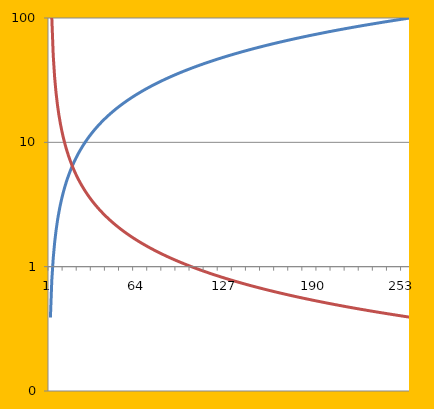
| Category | Series 0 | Series 1 |
|---|---|---|
| 0 | 0 | 0 |
| 1 | 0.391 | 100 |
| 2 | 0.781 | 100 |
| 3 | 1.172 | 50 |
| 4 | 1.562 | 33.333 |
| 5 | 1.953 | 25 |
| 6 | 2.344 | 20 |
| 7 | 2.734 | 16.667 |
| 8 | 3.125 | 14.286 |
| 9 | 3.516 | 12.5 |
| 10 | 3.906 | 11.111 |
| 11 | 4.297 | 10 |
| 12 | 4.688 | 9.091 |
| 13 | 5.078 | 8.333 |
| 14 | 5.469 | 7.692 |
| 15 | 5.859 | 7.143 |
| 16 | 6.25 | 6.667 |
| 17 | 6.641 | 6.25 |
| 18 | 7.031 | 5.882 |
| 19 | 7.422 | 5.556 |
| 20 | 7.812 | 5.263 |
| 21 | 8.203 | 5 |
| 22 | 8.594 | 4.762 |
| 23 | 8.984 | 4.545 |
| 24 | 9.375 | 4.348 |
| 25 | 9.766 | 4.167 |
| 26 | 10.156 | 4 |
| 27 | 10.547 | 3.846 |
| 28 | 10.938 | 3.704 |
| 29 | 11.328 | 3.571 |
| 30 | 11.719 | 3.448 |
| 31 | 12.109 | 3.333 |
| 32 | 12.5 | 3.226 |
| 33 | 12.891 | 3.125 |
| 34 | 13.281 | 3.03 |
| 35 | 13.672 | 2.941 |
| 36 | 14.062 | 2.857 |
| 37 | 14.453 | 2.778 |
| 38 | 14.844 | 2.703 |
| 39 | 15.234 | 2.632 |
| 40 | 15.625 | 2.564 |
| 41 | 16.016 | 2.5 |
| 42 | 16.406 | 2.439 |
| 43 | 16.797 | 2.381 |
| 44 | 17.188 | 2.326 |
| 45 | 17.578 | 2.273 |
| 46 | 17.969 | 2.222 |
| 47 | 18.359 | 2.174 |
| 48 | 18.75 | 2.128 |
| 49 | 19.141 | 2.083 |
| 50 | 19.531 | 2.041 |
| 51 | 19.922 | 2 |
| 52 | 20.312 | 1.961 |
| 53 | 20.703 | 1.923 |
| 54 | 21.094 | 1.887 |
| 55 | 21.484 | 1.852 |
| 56 | 21.875 | 1.818 |
| 57 | 22.266 | 1.786 |
| 58 | 22.656 | 1.754 |
| 59 | 23.047 | 1.724 |
| 60 | 23.438 | 1.695 |
| 61 | 23.828 | 1.667 |
| 62 | 24.219 | 1.639 |
| 63 | 24.609 | 1.613 |
| 64 | 25 | 1.587 |
| 65 | 25.391 | 1.562 |
| 66 | 25.781 | 1.538 |
| 67 | 26.172 | 1.515 |
| 68 | 26.562 | 1.493 |
| 69 | 26.953 | 1.471 |
| 70 | 27.344 | 1.449 |
| 71 | 27.734 | 1.429 |
| 72 | 28.125 | 1.408 |
| 73 | 28.516 | 1.389 |
| 74 | 28.906 | 1.37 |
| 75 | 29.297 | 1.351 |
| 76 | 29.688 | 1.333 |
| 77 | 30.078 | 1.316 |
| 78 | 30.469 | 1.299 |
| 79 | 30.859 | 1.282 |
| 80 | 31.25 | 1.266 |
| 81 | 31.641 | 1.25 |
| 82 | 32.031 | 1.235 |
| 83 | 32.422 | 1.22 |
| 84 | 32.812 | 1.205 |
| 85 | 33.203 | 1.19 |
| 86 | 33.594 | 1.176 |
| 87 | 33.984 | 1.163 |
| 88 | 34.375 | 1.149 |
| 89 | 34.766 | 1.136 |
| 90 | 35.156 | 1.124 |
| 91 | 35.547 | 1.111 |
| 92 | 35.938 | 1.099 |
| 93 | 36.328 | 1.087 |
| 94 | 36.719 | 1.075 |
| 95 | 37.109 | 1.064 |
| 96 | 37.5 | 1.053 |
| 97 | 37.891 | 1.042 |
| 98 | 38.281 | 1.031 |
| 99 | 38.672 | 1.02 |
| 100 | 39.062 | 1.01 |
| 101 | 39.453 | 1 |
| 102 | 39.844 | 0.99 |
| 103 | 40.234 | 0.98 |
| 104 | 40.625 | 0.971 |
| 105 | 41.016 | 0.962 |
| 106 | 41.406 | 0.952 |
| 107 | 41.797 | 0.943 |
| 108 | 42.188 | 0.935 |
| 109 | 42.578 | 0.926 |
| 110 | 42.969 | 0.917 |
| 111 | 43.359 | 0.909 |
| 112 | 43.75 | 0.901 |
| 113 | 44.141 | 0.893 |
| 114 | 44.531 | 0.885 |
| 115 | 44.922 | 0.877 |
| 116 | 45.312 | 0.87 |
| 117 | 45.703 | 0.862 |
| 118 | 46.094 | 0.855 |
| 119 | 46.484 | 0.847 |
| 120 | 46.875 | 0.84 |
| 121 | 47.266 | 0.833 |
| 122 | 47.656 | 0.826 |
| 123 | 48.047 | 0.82 |
| 124 | 48.438 | 0.813 |
| 125 | 48.828 | 0.806 |
| 126 | 49.219 | 0.8 |
| 127 | 49.609 | 0.794 |
| 128 | 50 | 0.787 |
| 129 | 50.391 | 0.781 |
| 130 | 50.781 | 0.775 |
| 131 | 51.172 | 0.769 |
| 132 | 51.562 | 0.763 |
| 133 | 51.953 | 0.758 |
| 134 | 52.344 | 0.752 |
| 135 | 52.734 | 0.746 |
| 136 | 53.125 | 0.741 |
| 137 | 53.516 | 0.735 |
| 138 | 53.906 | 0.73 |
| 139 | 54.297 | 0.725 |
| 140 | 54.688 | 0.719 |
| 141 | 55.078 | 0.714 |
| 142 | 55.469 | 0.709 |
| 143 | 55.859 | 0.704 |
| 144 | 56.25 | 0.699 |
| 145 | 56.641 | 0.694 |
| 146 | 57.031 | 0.69 |
| 147 | 57.422 | 0.685 |
| 148 | 57.812 | 0.68 |
| 149 | 58.203 | 0.676 |
| 150 | 58.594 | 0.671 |
| 151 | 58.984 | 0.667 |
| 152 | 59.375 | 0.662 |
| 153 | 59.766 | 0.658 |
| 154 | 60.156 | 0.654 |
| 155 | 60.547 | 0.649 |
| 156 | 60.938 | 0.645 |
| 157 | 61.328 | 0.641 |
| 158 | 61.719 | 0.637 |
| 159 | 62.109 | 0.633 |
| 160 | 62.5 | 0.629 |
| 161 | 62.891 | 0.625 |
| 162 | 63.281 | 0.621 |
| 163 | 63.672 | 0.617 |
| 164 | 64.062 | 0.613 |
| 165 | 64.453 | 0.61 |
| 166 | 64.844 | 0.606 |
| 167 | 65.234 | 0.602 |
| 168 | 65.625 | 0.599 |
| 169 | 66.016 | 0.595 |
| 170 | 66.406 | 0.592 |
| 171 | 66.797 | 0.588 |
| 172 | 67.188 | 0.585 |
| 173 | 67.578 | 0.581 |
| 174 | 67.969 | 0.578 |
| 175 | 68.359 | 0.575 |
| 176 | 68.75 | 0.571 |
| 177 | 69.141 | 0.568 |
| 178 | 69.531 | 0.565 |
| 179 | 69.922 | 0.562 |
| 180 | 70.312 | 0.559 |
| 181 | 70.703 | 0.556 |
| 182 | 71.094 | 0.552 |
| 183 | 71.484 | 0.549 |
| 184 | 71.875 | 0.546 |
| 185 | 72.266 | 0.543 |
| 186 | 72.656 | 0.541 |
| 187 | 73.047 | 0.538 |
| 188 | 73.438 | 0.535 |
| 189 | 73.828 | 0.532 |
| 190 | 74.219 | 0.529 |
| 191 | 74.609 | 0.526 |
| 192 | 75 | 0.524 |
| 193 | 75.391 | 0.521 |
| 194 | 75.781 | 0.518 |
| 195 | 76.172 | 0.515 |
| 196 | 76.562 | 0.513 |
| 197 | 76.953 | 0.51 |
| 198 | 77.344 | 0.508 |
| 199 | 77.734 | 0.505 |
| 200 | 78.125 | 0.503 |
| 201 | 78.516 | 0.5 |
| 202 | 78.906 | 0.498 |
| 203 | 79.297 | 0.495 |
| 204 | 79.688 | 0.493 |
| 205 | 80.078 | 0.49 |
| 206 | 80.469 | 0.488 |
| 207 | 80.859 | 0.485 |
| 208 | 81.25 | 0.483 |
| 209 | 81.641 | 0.481 |
| 210 | 82.031 | 0.478 |
| 211 | 82.422 | 0.476 |
| 212 | 82.812 | 0.474 |
| 213 | 83.203 | 0.472 |
| 214 | 83.594 | 0.469 |
| 215 | 83.984 | 0.467 |
| 216 | 84.375 | 0.465 |
| 217 | 84.766 | 0.463 |
| 218 | 85.156 | 0.461 |
| 219 | 85.547 | 0.459 |
| 220 | 85.938 | 0.457 |
| 221 | 86.328 | 0.455 |
| 222 | 86.719 | 0.452 |
| 223 | 87.109 | 0.45 |
| 224 | 87.5 | 0.448 |
| 225 | 87.891 | 0.446 |
| 226 | 88.281 | 0.444 |
| 227 | 88.672 | 0.442 |
| 228 | 89.062 | 0.441 |
| 229 | 89.453 | 0.439 |
| 230 | 89.844 | 0.437 |
| 231 | 90.234 | 0.435 |
| 232 | 90.625 | 0.433 |
| 233 | 91.016 | 0.431 |
| 234 | 91.406 | 0.429 |
| 235 | 91.797 | 0.427 |
| 236 | 92.188 | 0.426 |
| 237 | 92.578 | 0.424 |
| 238 | 92.969 | 0.422 |
| 239 | 93.359 | 0.42 |
| 240 | 93.75 | 0.418 |
| 241 | 94.141 | 0.417 |
| 242 | 94.531 | 0.415 |
| 243 | 94.922 | 0.413 |
| 244 | 95.312 | 0.412 |
| 245 | 95.703 | 0.41 |
| 246 | 96.094 | 0.408 |
| 247 | 96.484 | 0.407 |
| 248 | 96.875 | 0.405 |
| 249 | 97.266 | 0.403 |
| 250 | 97.656 | 0.402 |
| 251 | 98.047 | 0.4 |
| 252 | 98.438 | 0.398 |
| 253 | 98.828 | 0.397 |
| 254 | 99.219 | 0.395 |
| 255 | 99.609 | 0.394 |
| 256 | 100 | 0.392 |